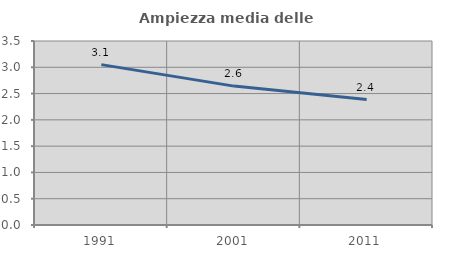
| Category | Ampiezza media delle famiglie |
|---|---|
| 1991.0 | 3.051 |
| 2001.0 | 2.642 |
| 2011.0 | 2.386 |